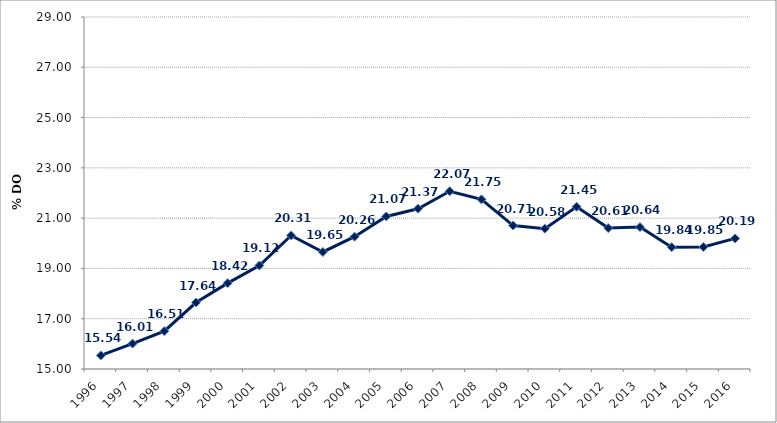
| Category | Series 0 |
|---|---|
| 1996 | 15.54 |
| 1997 | 16.011 |
| 1998 | 16.505 |
| 1999 | 17.644 |
| 2000 | 18.415 |
| 2001 | 19.117 |
| 2002 | 20.311 |
| 2003 | 19.654 |
| 2004 | 20.264 |
| 2005 | 21.068 |
| 2006 | 21.374 |
| 2007 | 22.069 |
| 2008 | 21.746 |
| 2009 | 20.706 |
| 2010 | 20.581 |
| 2011 | 21.454 |
| 2012 | 20.605 |
| 2013 | 20.644 |
| 2014 | 19.844 |
| 2015 | 19.852 |
| 2016 | 20.193 |